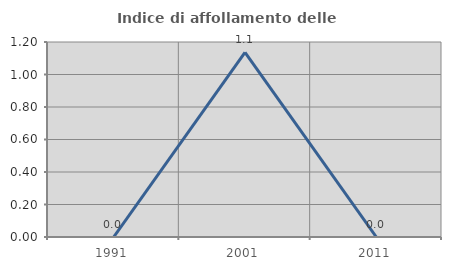
| Category | Indice di affollamento delle abitazioni  |
|---|---|
| 1991.0 | 0 |
| 2001.0 | 1.136 |
| 2011.0 | 0 |